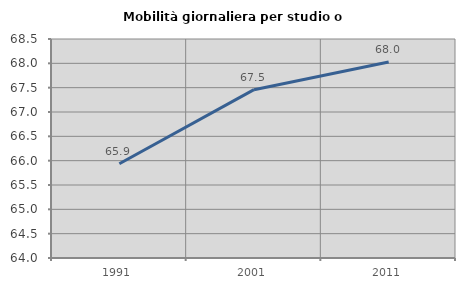
| Category | Mobilità giornaliera per studio o lavoro |
|---|---|
| 1991.0 | 65.937 |
| 2001.0 | 67.459 |
| 2011.0 | 68.026 |